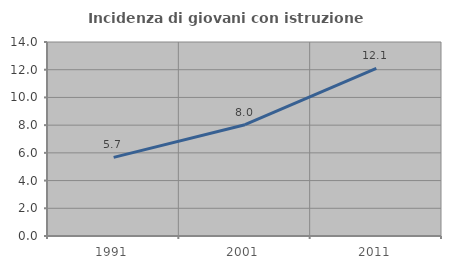
| Category | Incidenza di giovani con istruzione universitaria |
|---|---|
| 1991.0 | 5.675 |
| 2001.0 | 8.033 |
| 2011.0 | 12.105 |